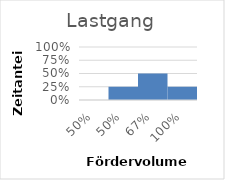
| Category | Series 1 |
|---|---|
| 0.5 | 0 |
| 0.5 | 0.25 |
| 0.67 | 0.5 |
| 1.0 | 0.25 |